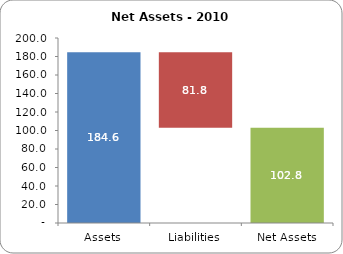
| Category | Series 0 | Series 1 |
|---|---|---|
| Assets | 0 | 184.649 |
| Liabilities | 102.848 | 81.801 |
| Net Assets | 0 | 102.848 |